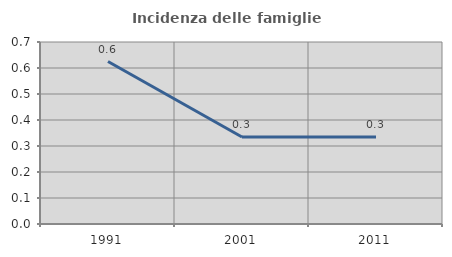
| Category | Incidenza delle famiglie numerose |
|---|---|
| 1991.0 | 0.625 |
| 2001.0 | 0.334 |
| 2011.0 | 0.334 |